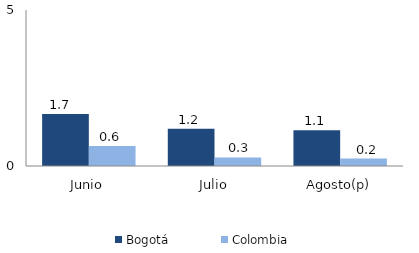
| Category | Bogotá | Colombia |
|---|---|---|
| Junio | 1.667 | 0.645 |
| Julio | 1.194 | 0.273 |
| Agosto(p) | 1.142 | 0.239 |